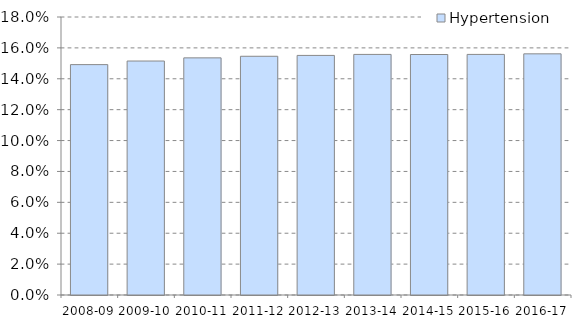
| Category | Hypertension |
|---|---|
| 2008-09 | 0.149 |
| 2009-10 | 0.151 |
| 2010-11 | 0.154 |
| 2011-12 | 0.155 |
| 2012-13 | 0.155 |
| 2013-14 | 0.156 |
| 2014-15 | 0.156 |
| 2015-16 | 0.156 |
| 2016-17 | 0.156 |